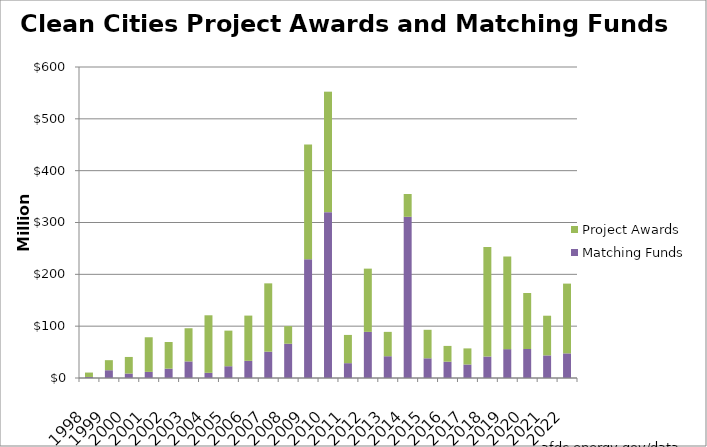
| Category | Matching Funds | Project Awards |
|---|---|---|
| 1998.0 | 2 | 8.5 |
| 1999.0 | 15 | 19.4 |
| 2000.0 | 8.6 | 32 |
| 2001.0 | 11.8 | 66.8 |
| 2002.0 | 18 | 51.5 |
| 2003.0 | 32 | 64 |
| 2004.0 | 10 | 111 |
| 2005.0 | 22.7 | 68.7 |
| 2006.0 | 33.1 | 87.3 |
| 2007.0 | 50.8 | 131.8 |
| 2008.0 | 66.1 | 34 |
| 2009.0 | 229.3 | 221 |
| 2010.0 | 320 | 232.4 |
| 2011.0 | 28.6 | 54.5 |
| 2012.0 | 89 | 122 |
| 2013.0 | 42 | 47 |
| 2014.0 | 311 | 44 |
| 2015.0 | 38 | 55 |
| 2016.0 | 31.5 | 30.4 |
| 2017.0 | 26 | 31.1 |
| 2018.0 | 41.4 | 211.4 |
| 2019.0 | 55.7 | 178.8 |
| 2020.0 | 55.9 | 108.1 |
| 2021.0 | 43.579 | 76.6 |
| 2022.0 | 47.5 | 134.6 |